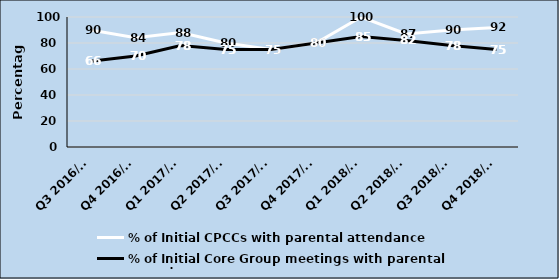
| Category | % of Initial CPCCs with parental attendance | % of Initial Core Group meetings with parental attendance |
|---|---|---|
| Q3 2016/17 | 90 | 66 |
| Q4 2016/17 | 84 | 70 |
| Q1 2017/18 | 88 | 78 |
| Q2 2017/18 | 80 | 75 |
| Q3 2017/18 | 75 | 75 |
| Q4 2017/18 | 80 | 80 |
| Q1 2018/19 | 100 | 85 |
| Q2 2018/19 | 87 | 82 |
| Q3 2018/19 | 90 | 78 |
| Q4 2018/19 | 92 | 75 |